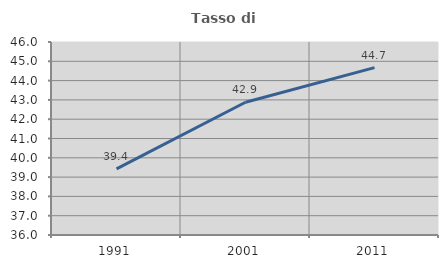
| Category | Tasso di occupazione   |
|---|---|
| 1991.0 | 39.423 |
| 2001.0 | 42.878 |
| 2011.0 | 44.672 |